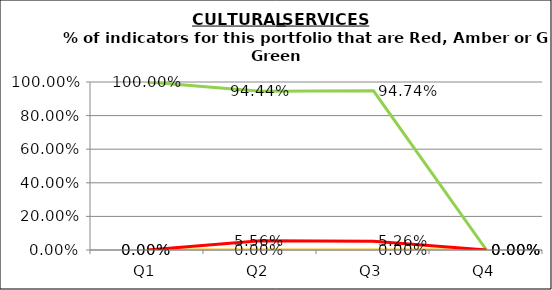
| Category | Green | Amber | Red |
|---|---|---|---|
| Q1 | 1 | 0 | 0 |
| Q2 | 0.944 | 0 | 0.056 |
| Q3 | 0.947 | 0 | 0.053 |
| Q4 | 0 | 0 | 0 |